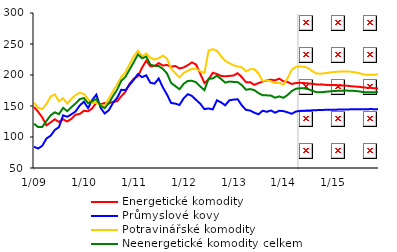
| Category | Energetické komodity | Průmyslové kovy | Potravinářské komodity | Neenergetické komodity celkem |
|---|---|---|---|---|
|  1/09 | 148.374 | 84.244 | 155.29 | 121.375 |
| 2 | 140.594 | 81.429 | 147.196 | 116.049 |
| 3 | 131.579 | 85.939 | 144.868 | 116.307 |
| 4 | 118.821 | 97.654 | 153.203 | 125.93 |
| 5 | 123.485 | 102.128 | 165.445 | 134.898 |
| 6 | 128.596 | 111.311 | 168.793 | 139.885 |
| 7 | 124.319 | 115.961 | 157.75 | 136.723 |
| 8 | 128.501 | 134.928 | 162.407 | 147.012 |
| 9 | 125.019 | 132.617 | 153.77 | 141.634 |
| 10 | 129.4 | 136.603 | 161.586 | 148.247 |
| 11 | 135.885 | 141.211 | 167.652 | 154.078 |
| 12 | 137.224 | 150.766 | 171.339 | 161.026 |
|  1/10 | 142.36 | 156.985 | 169.298 | 162.848 |
| 2 | 141.454 | 146.691 | 161.28 | 154.731 |
| 3 | 146.139 | 159.641 | 154.948 | 157.505 |
| 4 | 155.503 | 168.291 | 154.706 | 161.124 |
| 5 | 152.815 | 147.383 | 151.358 | 150.602 |
| 6 | 154.773 | 137.917 | 150.12 | 146.431 |
| 7 | 154.404 | 143.15 | 162.09 | 154.366 |
| 8 | 156.6 | 154.951 | 173.778 | 166.045 |
| 9 | 157.731 | 163.172 | 184.769 | 176.337 |
| 10 | 165.78 | 176.163 | 196.798 | 190.619 |
| 11 | 172.845 | 175.509 | 204.537 | 197.056 |
| 12 | 186.117 | 184.213 | 217.756 | 208.974 |
|  1/11 | 193.866 | 192.364 | 230.087 | 220.692 |
| 2 | 197.961 | 201.464 | 239.263 | 233.195 |
| 3 | 211.888 | 196.53 | 230.085 | 226.858 |
| 4 | 223.093 | 199.532 | 234.656 | 229.779 |
| 5 | 213.985 | 187.434 | 227.889 | 216.723 |
| 6 | 214.453 | 186.085 | 224.999 | 214.766 |
| 7 | 219.202 | 194.4 | 227.097 | 214.509 |
| 8 | 215.282 | 180.068 | 231.394 | 209.923 |
| 9 | 216.152 | 168.386 | 226.624 | 202.501 |
| 10 | 213.273 | 154.791 | 210.039 | 187.143 |
| 11 | 214.609 | 153.854 | 203.002 | 182.111 |
| 12 | 210.468 | 151.68 | 195.899 | 177.03 |
|  1/12 | 212.206 | 162.262 | 203.531 | 185.791 |
| 2 | 215.892 | 169.142 | 206.888 | 190.422 |
| 3 | 220.368 | 166.249 | 209.923 | 190.656 |
| 4 | 216.81 | 159.747 | 210.376 | 188.243 |
| 5 | 202.145 | 153.634 | 205.76 | 181.496 |
| 6 | 186.987 | 144.988 | 203.483 | 175.531 |
| 7 | 192.824 | 146.023 | 239.257 | 193.968 |
| 8 | 203.58 | 144.429 | 241.659 | 194.371 |
| 9 | 201.632 | 159.123 | 239.16 | 198.892 |
| 10 | 198.545 | 155.876 | 230.298 | 193.599 |
| 11 | 197.872 | 151.08 | 222.877 | 187.719 |
| 12 | 198.506 | 159.232 | 218.961 | 189.446 |
|  1/13 | 199.211 | 160.268 | 215.635 | 188.838 |
| 2 | 203.006 | 160.884 | 213.914 | 188.464 |
| 3 | 196.5 | 150.989 | 212.418 | 183.66 |
| 4 | 188.283 | 143.751 | 205.957 | 176.229 |
| 5 | 188.363 | 142.633 | 209.217 | 177.291 |
| 6 | 184.08 | 139.203 | 209.43 | 175.584 |
| 7 | 186.894 | 136.655 | 202.636 | 170.834 |
| 8 | 189.545 | 142.363 | 190.269 | 167.446 |
| 9 | 191.167 | 140.665 | 191.401 | 167.195 |
| 10 | 192.506 | 142.846 | 189.669 | 166.752 |
| 11 | 191.356 | 139.179 | 187.003 | 163.357 |
| 12 | 194.049 | 142.293 | 187.396 | 165.509 |
|  1/14 | 189.868 | 141.755 | 184.207 | 163.226 |
| 2 | 188.877 | 139.824 | 194.827 | 167.719 |
| 3 | 185.58 | 137.422 | 208.545 | 174.079 |
| 4 | 187.01 | 141.087 | 213.064 | 177.799 |
| 5 | 187.482 | 142.092 | 213.73 | 178.659 |
| 6 | 186.953 | 142.393 | 213.178 | 178.448 |
| 7 | 186.407 | 142.719 | 211.031 | 177.151 |
| 8 | 185.674 | 143.039 | 206.079 | 174.312 |
| 9 | 184.792 | 143.31 | 202.341 | 172.276 |
| 10 | 184.88 | 143.524 | 202.116 | 172.23 |
| 11 | 184.255 | 143.793 | 202.916 | 172.809 |
| 12 | 183.65 | 144.005 | 203.84 | 173.503 |
|  1/15 | 183.853 | 144.051 | 204.655 | 174.064 |
| 2 | 183.395 | 144.162 | 205.273 | 174.461 |
| 3 | 182.982 | 144.285 | 205.704 | 174.728 |
| 4 | 182.902 | 144.43 | 205.816 | 174.849 |
| 5 | 182.145 | 144.578 | 205.451 | 174.727 |
| 6 | 181.426 | 144.637 | 204.645 | 174.342 |
| 7 | 181.088 | 144.715 | 203.38 | 173.731 |
| 8 | 180.231 | 144.822 | 201.424 | 172.745 |
| 9 | 179.494 | 144.919 | 200.137 | 172.105 |
| 10 | 179.227 | 144.979 | 200.347 | 172.192 |
| 11 | 178.57 | 144.928 | 200.624 | 172.278 |
| 12 | 178.213 | 144.872 | 200.728 | 172.303 |